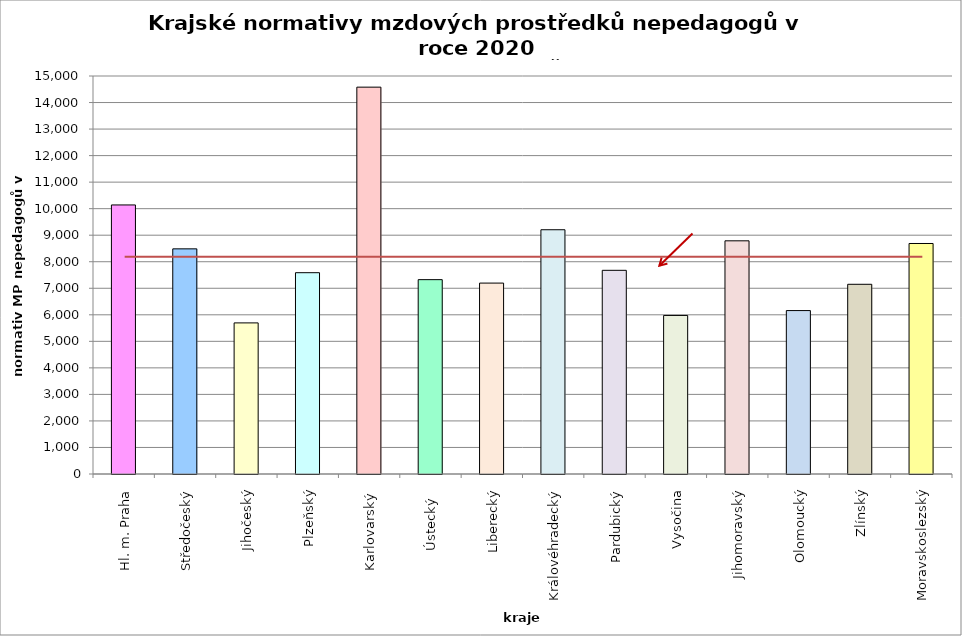
| Category | Series 0 |
|---|---|
| Hl. m. Praha | 10140.043 |
| Středočeský | 8485.2 |
| Jihočeský | 5695.028 |
| Plzeňský | 7587 |
| Karlovarský  | 14580 |
| Ústecký   | 7325.064 |
| Liberecký | 7195.196 |
| Královéhradecký | 9205.72 |
| Pardubický | 7676.386 |
| Vysočina | 5975.429 |
| Jihomoravský | 8788.295 |
| Olomoucký | 6159.3 |
| Zlínský | 7149.711 |
| Moravskoslezský | 8687.415 |